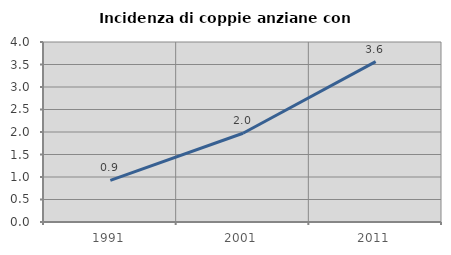
| Category | Incidenza di coppie anziane con figli |
|---|---|
| 1991.0 | 0.927 |
| 2001.0 | 1.972 |
| 2011.0 | 3.562 |